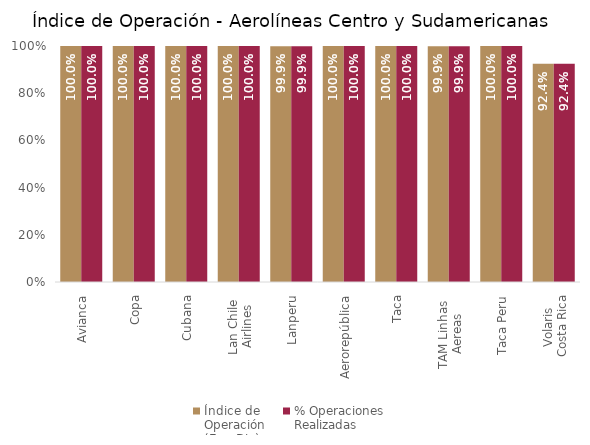
| Category | Índice de 
Operación
(Ene-Dic) | % Operaciones
Realizadas |
|---|---|---|
| Avianca | 1 | 1 |
| Copa | 1 | 1 |
| Cubana | 1 | 1 |
| Lan Chile 
Airlines | 1 | 1 |
| Lanperu | 0.999 | 0.999 |
| Aerorepública | 1 | 1 |
| Taca | 1 | 1 |
| TAM Linhas 
Aereas | 0.999 | 0.999 |
| Taca Peru | 1 | 1 |
| Volaris 
Costa Rica | 0.924 | 0.924 |